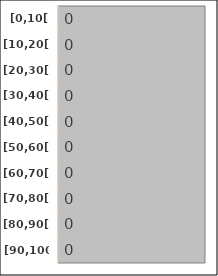
| Category | Series 0 |
|---|---|
| [0,10[ | 0 |
| [10,20[ | 0 |
| [20,30[ | 0 |
| [30,40[ | 0 |
| [40,50[ | 0 |
| [50,60[ | 0 |
| [60,70[ | 0 |
| [70,80[ | 0 |
| [80,90[ | 0 |
| [90,100] | 0 |